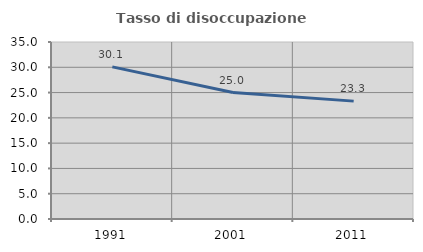
| Category | Tasso di disoccupazione giovanile  |
|---|---|
| 1991.0 | 30.085 |
| 2001.0 | 25 |
| 2011.0 | 23.308 |